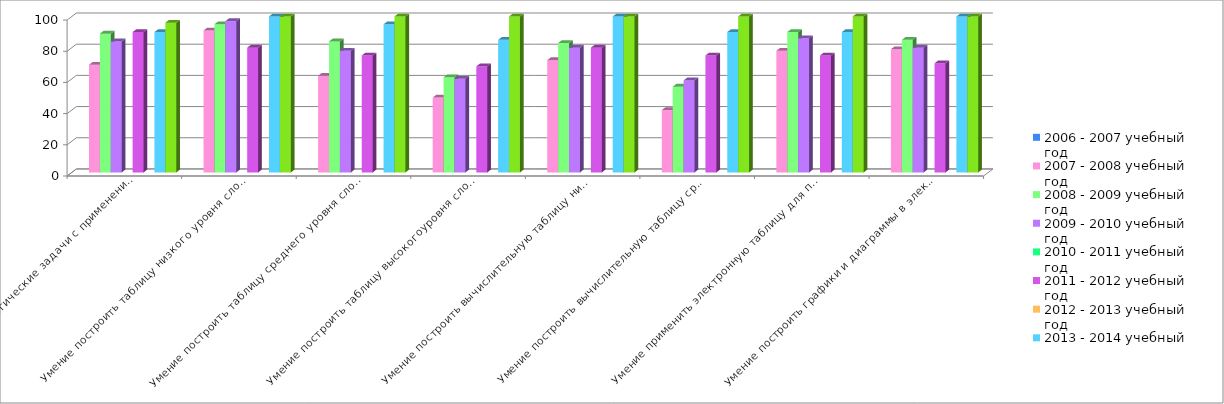
| Category | 2006 - 2007 учебный год | 2007 - 2008 учебный год | 2008 - 2009 учебный год | 2009 - 2010 учебный год | 2010 - 2011 учебный год | 2011 - 2012 учебный год | 2012 - 2013 учебный год | 2013 - 2014 учебный год | 2014 - 2015 учебный год |
|---|---|---|---|---|---|---|---|---|---|
| Умение решать логические задачи с применением табличного метода |  | 69 | 89 | 84 |  | 90 |  | 90 | 96 |
| Умение построить таблицу низкого уровня сложности, применив приемы классификации информации |  | 91 | 95 | 97 |  | 80 |  | 100 | 100 |
| Умение построить таблицу среднего уровня сложности, применив приемы классификации информации |  | 62 | 84 | 78 |  | 75 |  | 95 | 100 |
| Умение построить таблицу высокогоуровня сложности, применив приемы классификации информации* (дополнительный материал) |  | 48 | 61 | 60 |  | 68 |  | 85 | 100 |
| Умение построить вычислительную таблицу низкого уровня сложности |  | 72 | 83 | 80 |  | 80 |  | 100 | 100 |
| Умение построить вычислительную таблицу среднего уровня сложности* (дополнительный материал) |  | 40 | 55 | 59 |  | 75 |  | 90 | 100 |
| Умение применить электронную таблицу для простейших автоматизированных вычислений |  | 78 | 90 | 86 |  | 75 |  | 90 | 100 |
| Умение построить графики и диаграммы в электронных таблицах |  | 79 | 85 | 80 |  | 70 |  | 100 | 100 |